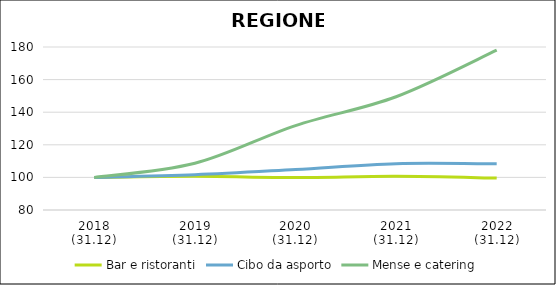
| Category | Bar e ristoranti | Cibo da asporto | Mense e catering |
|---|---|---|---|
| 2018
(31.12) | 100 | 100 | 100 |
| 2019
(31.12) | 100.634 | 101.616 | 108.67 |
| 2020
(31.12) | 99.923 | 104.847 | 131.807 |
| 2021
(31.12) | 100.642 | 108.429 | 149.489 |
| 2022
(31.12) | 99.565 | 108.317 | 178.032 |